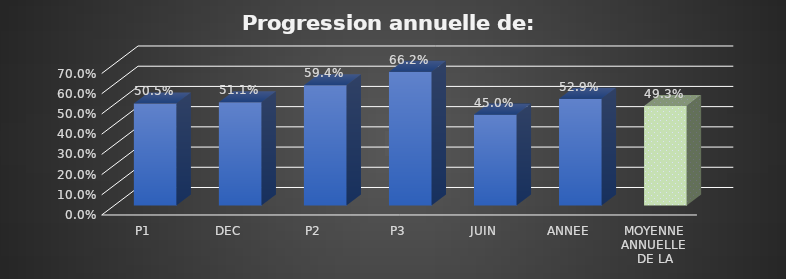
| Category | Series 0 |
|---|---|
| P1 | 0.505 |
| DEC | 0.511 |
| P2 | 0.594 |
| P3 | 0.662 |
| JUIN | 0.45 |
| ANNEE | 0.529 |
| MOYENNE ANNUELLE 
DE LA CLASSE | 0.493 |